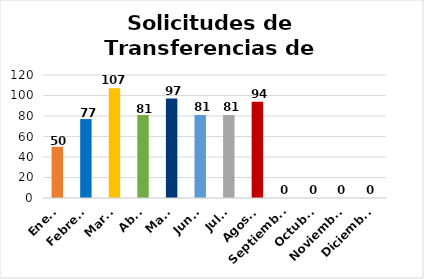
| Category | Solicitudes de Transferencias Fase I |
|---|---|
| Enero | 50 |
| Febrero | 77 |
| Marzo | 107 |
| Abril | 81 |
| Mayo | 97 |
| Junio | 81 |
| Julio | 81 |
| Agosto | 94 |
| Septiembre | 0 |
| Octubre | 0 |
| Noviembre | 0 |
| Diciembre | 0 |